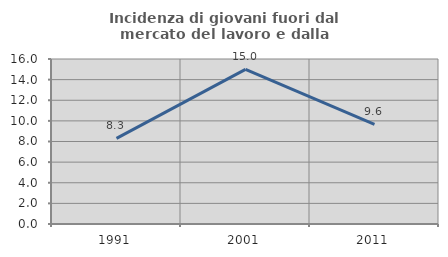
| Category | Incidenza di giovani fuori dal mercato del lavoro e dalla formazione  |
|---|---|
| 1991.0 | 8.298 |
| 2001.0 | 14.992 |
| 2011.0 | 9.649 |